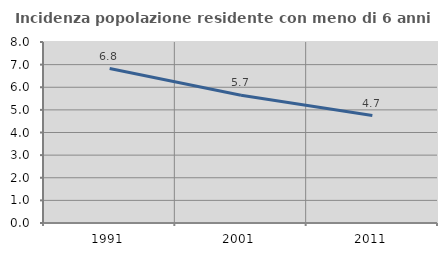
| Category | Incidenza popolazione residente con meno di 6 anni |
|---|---|
| 1991.0 | 6.825 |
| 2001.0 | 5.65 |
| 2011.0 | 4.749 |